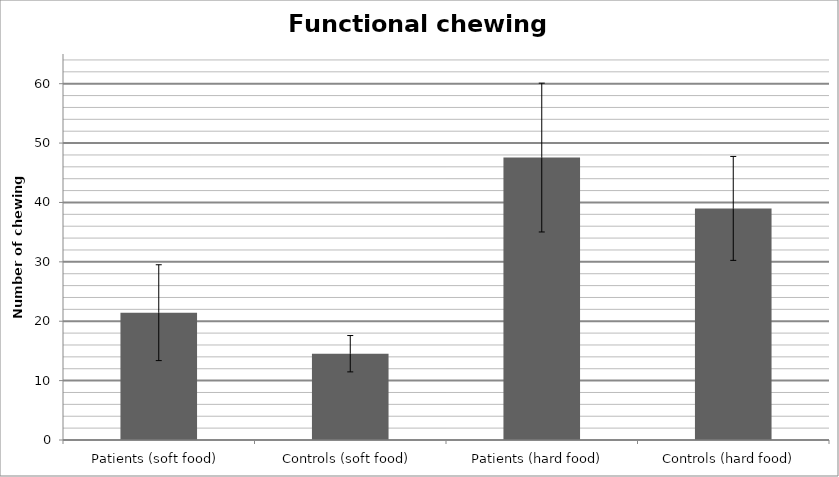
| Category | Series 0 |
|---|---|
| Patients (soft food)  | 21.44 |
| Controls (soft food)  | 14.53 |
| Patients (hard food)  | 47.56 |
| Controls (hard food)  | 39 |